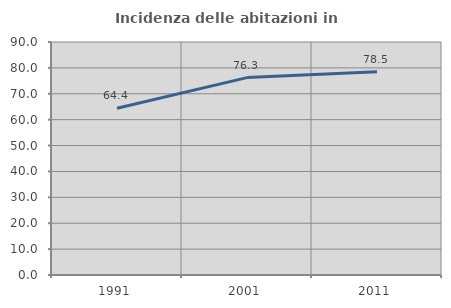
| Category | Incidenza delle abitazioni in proprietà  |
|---|---|
| 1991.0 | 64.402 |
| 2001.0 | 76.253 |
| 2011.0 | 78.532 |